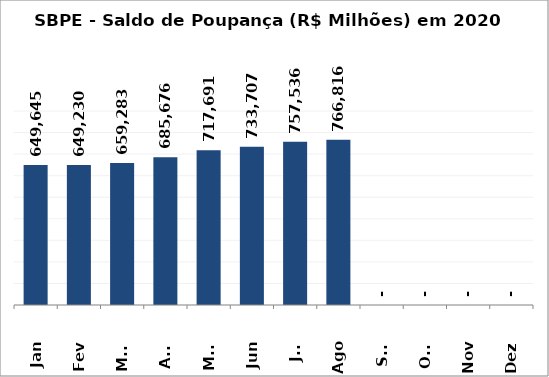
| Category | SBPE - Saldo de Poupança (R$ Milhões) em 2020 |
|---|---|
| Jan | 649645.04 |
| Fev | 649229.63 |
| Mar | 659283.469 |
| Abr | 685675.702 |
| Mai | 717690.899 |
| Jun | 733706.661 |
| Jul | 757535.898 |
| Ago | 766816.29 |
| Set | 0 |
| Out | 0 |
| Nov | 0 |
| Dez | 0 |